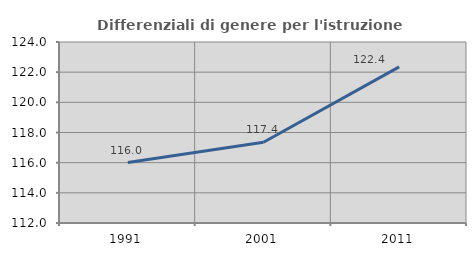
| Category | Differenziali di genere per l'istruzione superiore |
|---|---|
| 1991.0 | 116.006 |
| 2001.0 | 117.355 |
| 2011.0 | 122.352 |